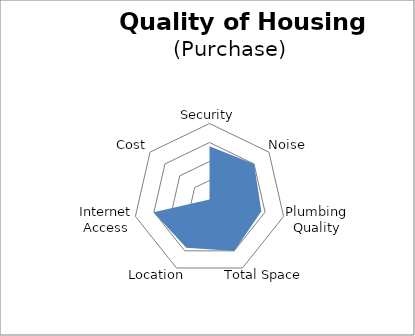
| Category | Series 0 |
|---|---|
| Security | 70 |
| Noise | 75 |
| Plumbing Quality | 70 |
| Total Space | 75.065 |
| Location | 70.469 |
| Internet Access | 75.427 |
| Cost | 0 |